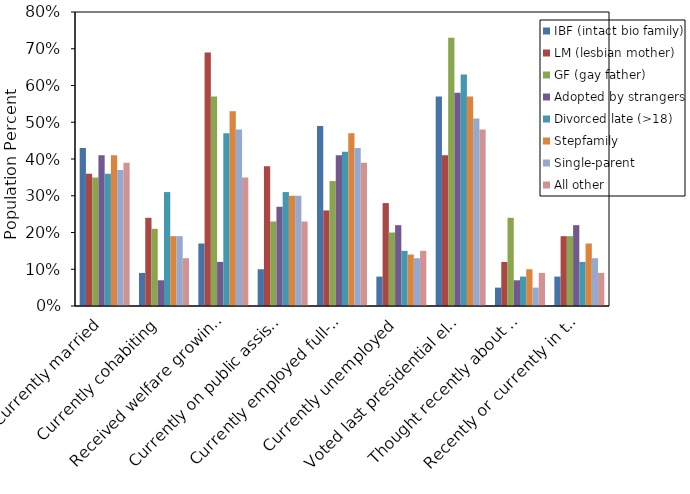
| Category | IBF (intact bio family) | LM (lesbian mother) | GF (gay father) | Adopted by strangers | Divorced late (>18) | Stepfamily | Single-parent | All other |
|---|---|---|---|---|---|---|---|---|
| Currently married | 0.43 | 0.36 | 0.35 | 0.41 | 0.36 | 0.41 | 0.37 | 0.39 |
| Currently cohabiting | 0.09 | 0.24 | 0.21 | 0.07 | 0.31 | 0.19 | 0.19 | 0.13 |
| Received welfare growing up | 0.17 | 0.69 | 0.57 | 0.12 | 0.47 | 0.53 | 0.48 | 0.35 |
| Currently on public assistance | 0.1 | 0.38 | 0.23 | 0.27 | 0.31 | 0.3 | 0.3 | 0.23 |
| Currently employed full-time | 0.49 | 0.26 | 0.34 | 0.41 | 0.42 | 0.47 | 0.43 | 0.39 |
| Currently unemployed | 0.08 | 0.28 | 0.2 | 0.22 | 0.15 | 0.14 | 0.13 | 0.15 |
| Voted last presidential election | 0.57 | 0.41 | 0.73 | 0.58 | 0.63 | 0.57 | 0.51 | 0.48 |
| Thought recently about suicide | 0.05 | 0.12 | 0.24 | 0.07 | 0.08 | 0.1 | 0.05 | 0.09 |
| Recently or currently in therapy | 0.08 | 0.19 | 0.19 | 0.22 | 0.12 | 0.17 | 0.13 | 0.09 |